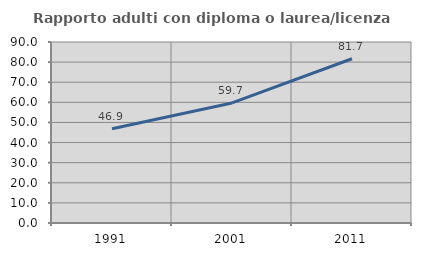
| Category | Rapporto adulti con diploma o laurea/licenza media  |
|---|---|
| 1991.0 | 46.865 |
| 2001.0 | 59.694 |
| 2011.0 | 81.681 |